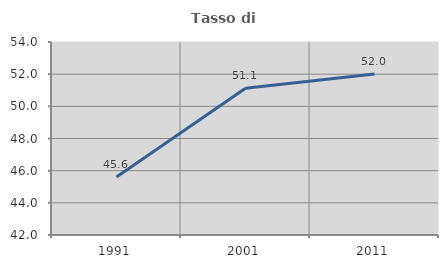
| Category | Tasso di occupazione   |
|---|---|
| 1991.0 | 45.61 |
| 2001.0 | 51.125 |
| 2011.0 | 52.015 |